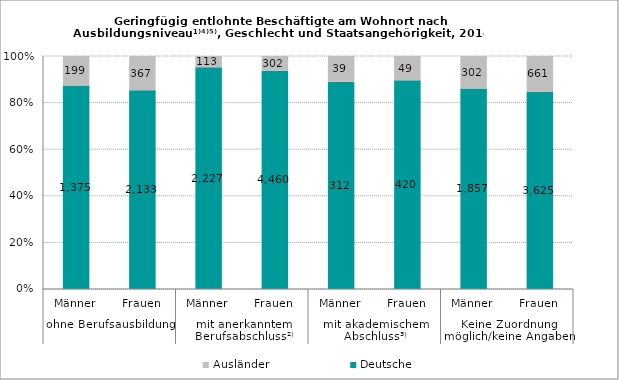
| Category | Deutsche | Ausländer |
|---|---|---|
| 0 | 1375 | 199 |
| 1 | 2133 | 367 |
| 2 | 2227 | 113 |
| 3 | 4460 | 302 |
| 4 | 312 | 39 |
| 5 | 420 | 49 |
| 6 | 1857 | 302 |
| 7 | 3625 | 661 |